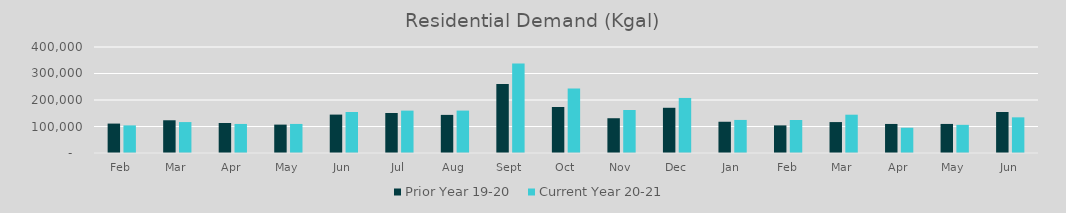
| Category | Prior Year 19-20  | Current Year 20-21 |
|---|---|---|
| Feb | 111009.962 | 104204.224 |
| Mar | 123525.131 | 116687.491 |
| Apr | 113258.787 | 109598.965 |
| May | 107128.051 | 109656.015 |
| Jun | 144930.453 | 154696.236 |
| Jul | 151028.014 | 159889.353 |
| Aug | 143816.337 | 160013.985 |
| Sep | 260607.456 | 337995.641 |
| Oct | 173601.368 | 243049.084 |
| Nov | 131198.833 | 162175.563 |
| Dec | 170629.384 | 207737.904 |
| Jan | 117899.625 | 124779.797 |
| Feb | 104204.224 | 124538.238 |
| Mar | 116687.491 | 144510.137 |
| Apr | 109598.965 | 95313.825 |
| May | 109656.015 | 106271.913 |
| Jun | 154696.236 | 134556.172 |